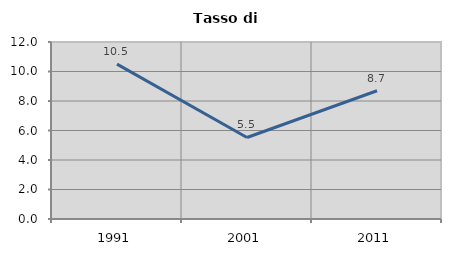
| Category | Tasso di disoccupazione   |
|---|---|
| 1991.0 | 10.498 |
| 2001.0 | 5.528 |
| 2011.0 | 8.696 |